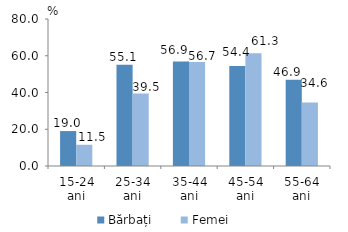
| Category | Bărbați | Femei |
|---|---|---|
| 15-24 ani | 19.01 | 11.548 |
| 25-34 ani | 55.127 | 39.471 |
| 35-44 ani | 56.86 | 56.655 |
| 45-54 ani | 54.376 | 61.309 |
| 55-64 ani | 46.909 | 34.591 |